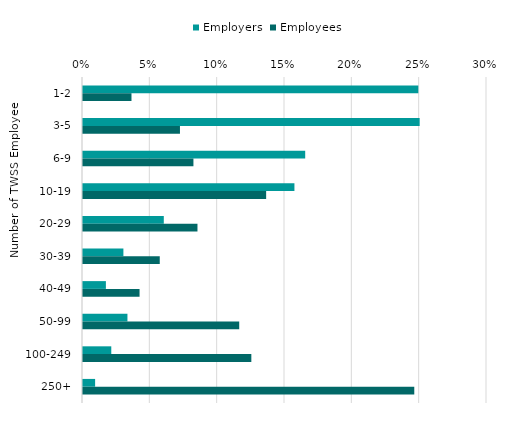
| Category | Employers | Employees |
|---|---|---|
| 1-2 | 0.249 | 0.036 |
| 3-5 | 0.25 | 0.072 |
| 6-9 | 0.165 | 0.082 |
| 10-19 | 0.157 | 0.136 |
| 20-29 | 0.06 | 0.085 |
| 30-39 | 0.03 | 0.057 |
| 40-49 | 0.017 | 0.042 |
| 50-99 | 0.033 | 0.116 |
| 100-249 | 0.021 | 0.125 |
| 250+ | 0.009 | 0.246 |